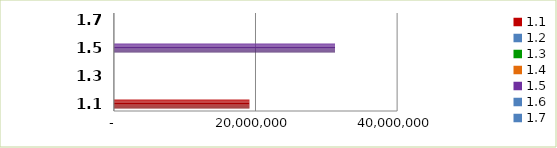
| Category | Series 0 |
|---|---|
| 1.1 | 19141960.82 |
| 1.2 | 0 |
| 1.3 | 0 |
| 1.4 | 0 |
| 1.5 | 31231819.785 |
| 1.6 | 0 |
| 1.7 | 0 |